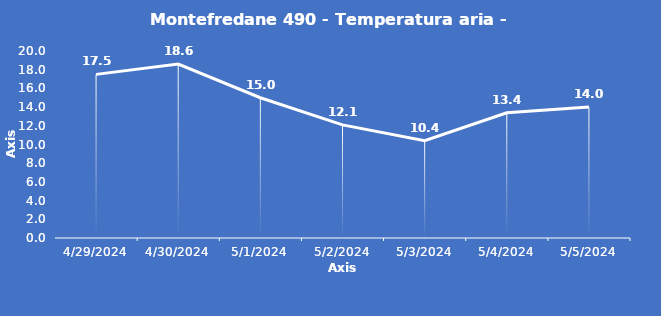
| Category | Montefredane 490 - Temperatura aria - Grezzo (°C) |
|---|---|
| 4/29/24 | 17.5 |
| 4/30/24 | 18.6 |
| 5/1/24 | 15 |
| 5/2/24 | 12.1 |
| 5/3/24 | 10.4 |
| 5/4/24 | 13.4 |
| 5/5/24 | 14 |